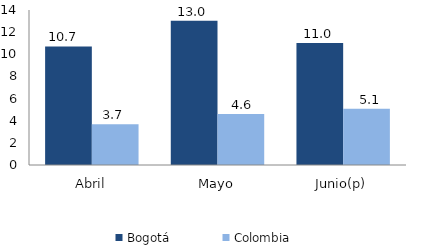
| Category | Bogotá | Colombia |
|---|---|---|
| Abril | 10.707 | 3.683 |
| Mayo | 13.02 | 4.609 |
| Junio(p) | 11.015 | 5.077 |